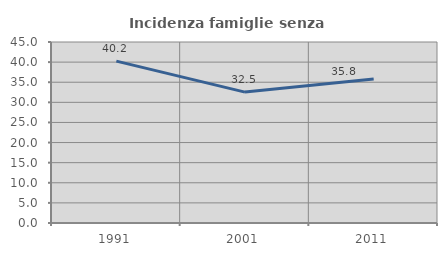
| Category | Incidenza famiglie senza nuclei |
|---|---|
| 1991.0 | 40.244 |
| 2001.0 | 32.544 |
| 2011.0 | 35.829 |